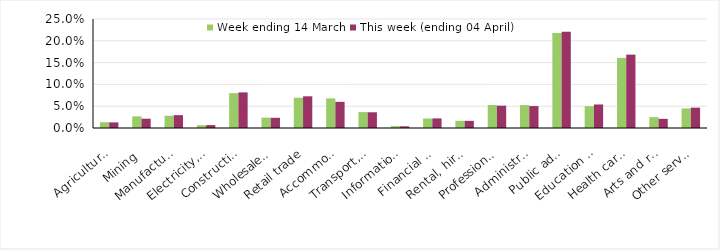
| Category | Week ending 14 March | This week (ending 04 April) |
|---|---|---|
| Agriculture, forestry and fishing | 0.013 | 0.013 |
| Mining | 0.027 | 0.021 |
| Manufacturing | 0.028 | 0.029 |
| Electricity, gas, water and waste services | 0.006 | 0.007 |
| Construction | 0.08 | 0.082 |
| Wholesale trade | 0.024 | 0.023 |
| Retail trade | 0.069 | 0.073 |
| Accommodation and food services | 0.068 | 0.06 |
| Transport, postal and warehousing | 0.036 | 0.036 |
| Information media and telecommunications | 0.004 | 0.004 |
| Financial and insurance services | 0.022 | 0.022 |
| Rental, hiring and real estate services | 0.016 | 0.016 |
| Professional, scientific and technical services | 0.053 | 0.051 |
| Administrative and support services | 0.053 | 0.05 |
| Public administration and safety | 0.218 | 0.221 |
| Education and training | 0.05 | 0.054 |
| Health care and social assistance | 0.161 | 0.168 |
| Arts and recreation services | 0.025 | 0.021 |
| Other services | 0.045 | 0.047 |